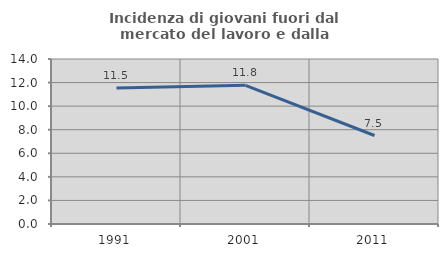
| Category | Incidenza di giovani fuori dal mercato del lavoro e dalla formazione  |
|---|---|
| 1991.0 | 11.547 |
| 2001.0 | 11.765 |
| 2011.0 | 7.509 |